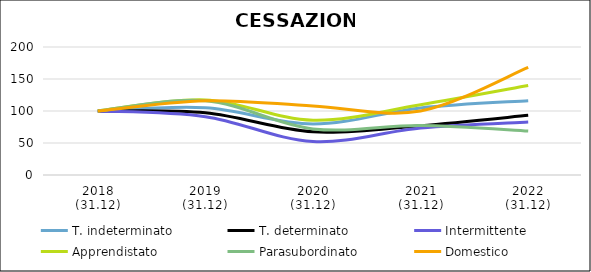
| Category | T. indeterminato | T. determinato | Intermittente | Apprendistato | Parasubordinato | Domestico |
|---|---|---|---|---|---|---|
| 2018
(31.12) | 100 | 100 | 100 | 100 | 100 | 100 |
| 2019
(31.12) | 104.923 | 97.19 | 91.133 | 117.291 | 116.055 | 116 |
| 2020
(31.12) | 79.672 | 67.426 | 52.217 | 85.561 | 72.018 | 108 |
| 2021
(31.12) | 104.831 | 77.068 | 73.399 | 109.804 | 77.523 | 100 |
| 2022
(31.12) | 116.18 | 93.202 | 82.759 | 139.75 | 68.807 | 168 |